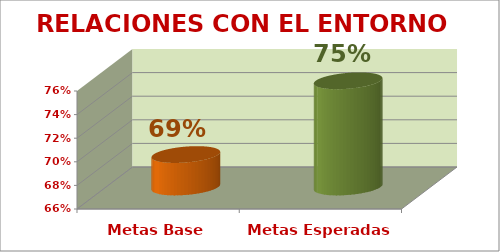
| Category | RELACIONES CON EL ENTORNO |
|---|---|
| Metas Base | 0.688 |
| Metas Esperadas | 0.75 |